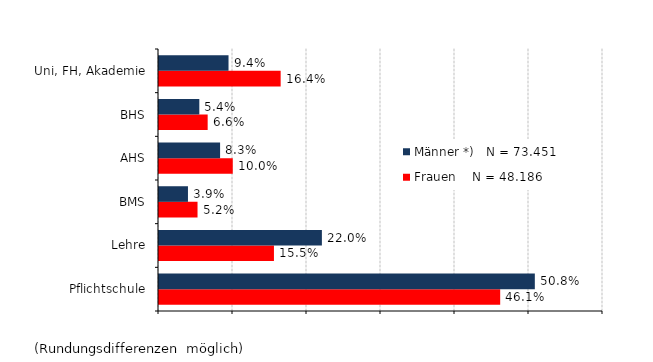
| Category | Frauen    N = 48.186 | Männer *)   N = 73.451 |
|---|---|---|
| Pflichtschule | 0.461 | 0.508 |
| Lehre | 0.155 | 0.22 |
| BMS | 0.052 | 0.039 |
| AHS | 0.1 | 0.083 |
| BHS | 0.066 | 0.054 |
| Uni, FH, Akademie | 0.164 | 0.094 |